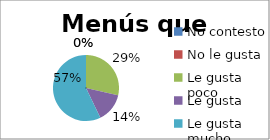
| Category | Series 0 |
|---|---|
| No contesto | 0 |
| No le gusta | 0 |
| Le gusta poco | 2 |
| Le gusta | 1 |
| Le gusta mucho | 4 |